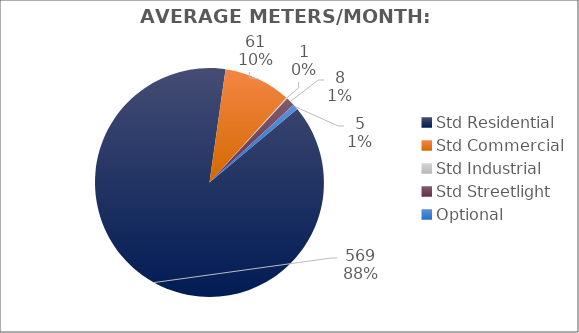
| Category | Meters |
|---|---|
| Std Residential | 569 |
| Std Commercial | 61 |
| Std Industrial | 1 |
| Std Streetlight | 8 |
| Optional | 5 |